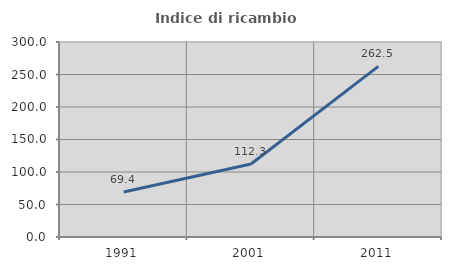
| Category | Indice di ricambio occupazionale  |
|---|---|
| 1991.0 | 69.355 |
| 2001.0 | 112.291 |
| 2011.0 | 262.5 |